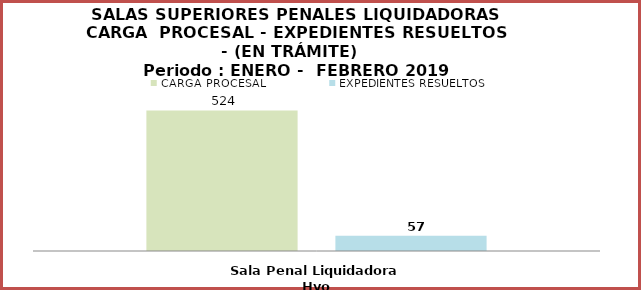
| Category | CARGA PROCESAL | EXPEDIENTES RESUELTOS |
|---|---|---|
| Sala Penal Liquidadora Hyo | 524 | 57 |